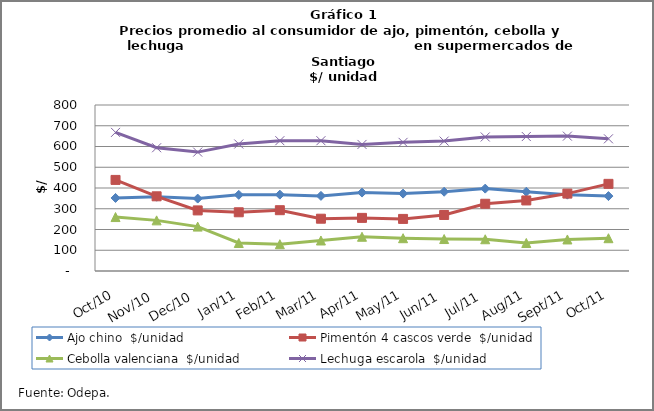
| Category | Ajo chino  | Pimentón 4 cascos verde  | Cebolla valenciana  | Lechuga escarola  |
|---|---|---|---|---|
| 2010-10-01 | 352 | 439 | 260 | 668 |
| 2010-11-01 | 358 | 360 | 244 | 594 |
| 2010-12-01 | 349 | 292 | 214 | 573 |
| 2011-01-01 | 367 | 283 | 135 | 612 |
| 2011-02-01 | 368 | 293 | 129 | 628 |
| 2011-03-01 | 362 | 252 | 147 | 628 |
| 2011-04-01 | 378 | 256 | 165 | 610 |
| 2011-05-01 | 373 | 251 | 158 | 620 |
| 2011-06-01 | 382 | 270 | 154 | 626 |
| 2011-07-01 | 397 | 324 | 153 | 646 |
| 2011-08-01 | 382 | 340 | 135 | 648 |
| 2011-09-01 | 368 | 373 | 152 | 650 |
| 2011-10-01 | 361 | 420 | 158 | 637 |